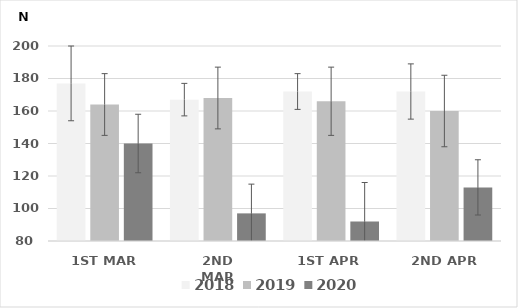
| Category | 2018 | 2019 | 2020 |
|---|---|---|---|
| 1ST MAR | 177 | 164 | 140 |
| 2ND MAR | 167 | 168 | 97 |
| 1ST APR | 172 | 166 | 92 |
| 2ND APR | 172 | 160 | 113 |